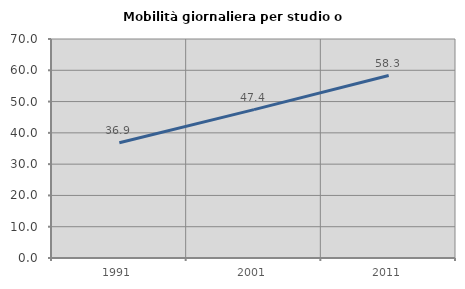
| Category | Mobilità giornaliera per studio o lavoro |
|---|---|
| 1991.0 | 36.856 |
| 2001.0 | 47.423 |
| 2011.0 | 58.333 |